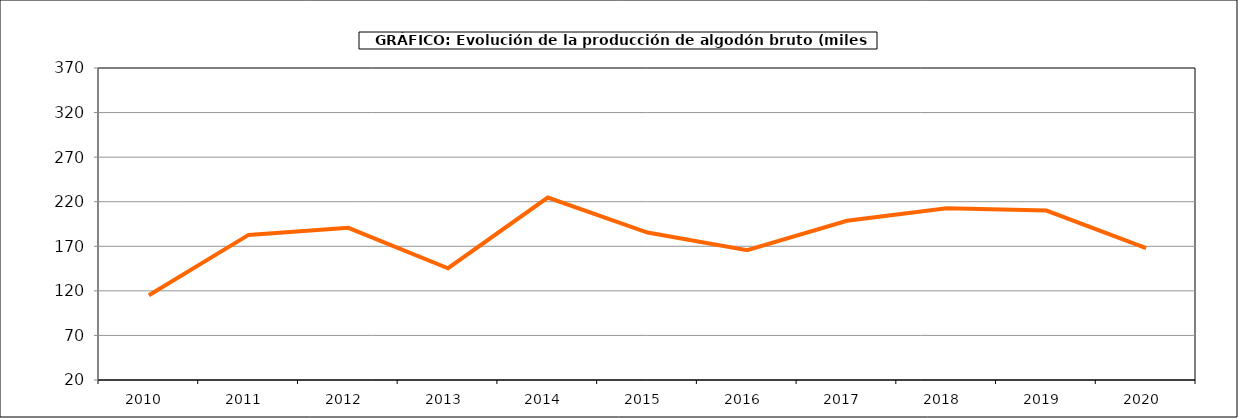
| Category | Producción |
|---|---|
| 2010.0 | 115.088 |
| 2011.0 | 182.781 |
| 2012.0 | 190.7 |
| 2013.0 | 145.356 |
| 2014.0 | 224.734 |
| 2015.0 | 185.446 |
| 2016.0 | 165.596 |
| 2017.0 | 198.547 |
| 2018.0 | 212.587 |
| 2019.0 | 210.015 |
| 2020.0 | 167.828 |